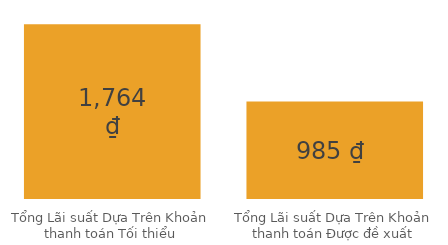
| Category | Series 0 |
|---|---|
| Tổng Lãi suất Dựa Trên Khoản thanh toán Tối thiểu | 1763.952 |
| Tổng Lãi suất Dựa Trên Khoản thanh toán Được đề xuất | 984.811 |